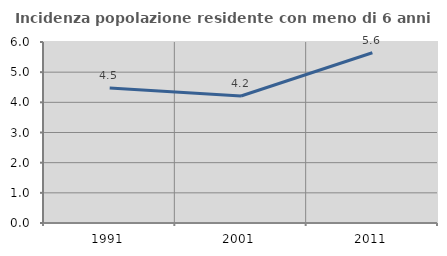
| Category | Incidenza popolazione residente con meno di 6 anni |
|---|---|
| 1991.0 | 4.478 |
| 2001.0 | 4.211 |
| 2011.0 | 5.644 |